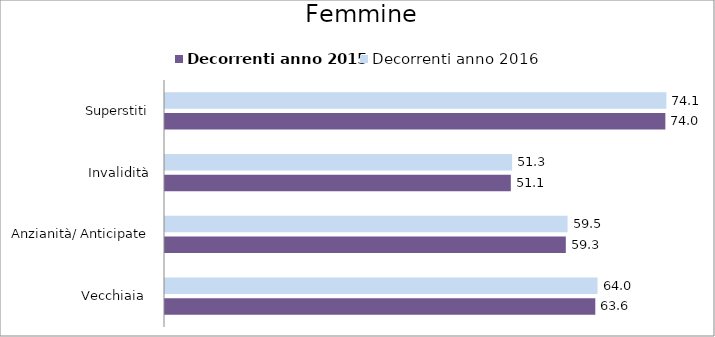
| Category | Decorrenti anno 2015 | Decorrenti anno 2016 |
|---|---|---|
| Vecchiaia  | 63.63 | 63.96 |
| Anzianità/ Anticipate | 59.27 | 59.53 |
| Invalidità | 51.14 | 51.33 |
| Superstiti | 73.99 | 74.14 |